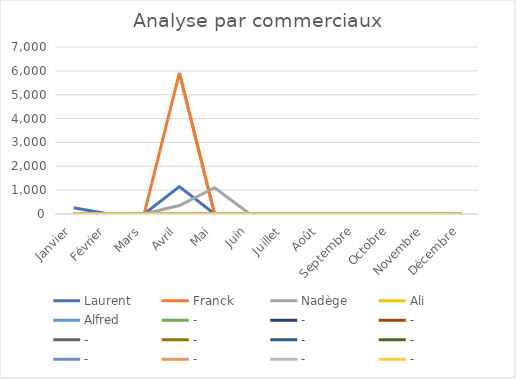
| Category | Laurent | Franck | Nadège | Ali | Alfred | - |
|---|---|---|---|---|---|---|
| Janvier | 258 | 0 | 0 | 0 | 0 | 0 |
| Février | 0 | 0 | 0 | 0 | 0 | 0 |
| Mars | 0 | 0 | 0 | 0 | 0 | 0 |
| Avril | 1147 | 5917 | 355 | 0 | 0 | 0 |
| Mai | 0 | 0 | 1102 | 0 | 0 | 0 |
| Juin | 0 | 0 | 0 | 0 | 0 | 0 |
| Juillet | 0 | 0 | 0 | 0 | 0 | 0 |
| Août | 0 | 0 | 0 | 0 | 0 | 0 |
| Septembre | 0 | 0 | 0 | 0 | 0 | 0 |
| Octobre | 0 | 0 | 0 | 0 | 0 | 0 |
| Novembre | 0 | 0 | 0 | 0 | 0 | 0 |
| Décembre | 0 | 0 | 0 | 0 | 0 | 0 |